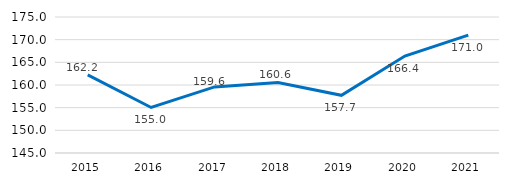
| Category | Series 0 |
|---|---|
| 2015.0 | 162.232 |
| 2016.0 | 155.038 |
| 2017.0 | 159.57 |
| 2018.0 | 160.567 |
| 2019.0 | 157.724 |
| 2020.0 | 166.385 |
| 2021.0 | 171.005 |